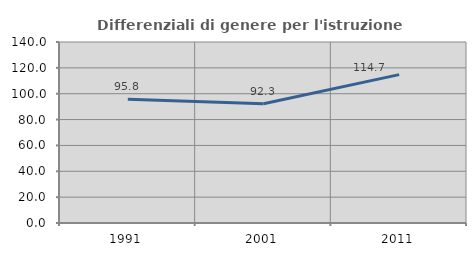
| Category | Differenziali di genere per l'istruzione superiore |
|---|---|
| 1991.0 | 95.794 |
| 2001.0 | 92.263 |
| 2011.0 | 114.748 |